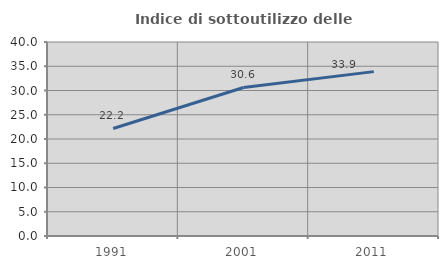
| Category | Indice di sottoutilizzo delle abitazioni  |
|---|---|
| 1991.0 | 22.168 |
| 2001.0 | 30.619 |
| 2011.0 | 33.893 |